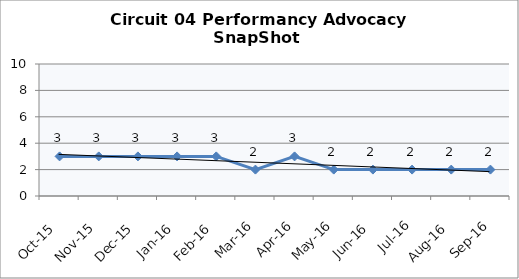
| Category | Circuit 04 |
|---|---|
| Oct-15 | 3 |
| Nov-15 | 3 |
| Dec-15 | 3 |
| Jan-16 | 3 |
| Feb-16 | 3 |
| Mar-16 | 2 |
| Apr-16 | 3 |
| May-16 | 2 |
| Jun-16 | 2 |
| Jul-16 | 2 |
| Aug-16 | 2 |
| Sep-16 | 2 |